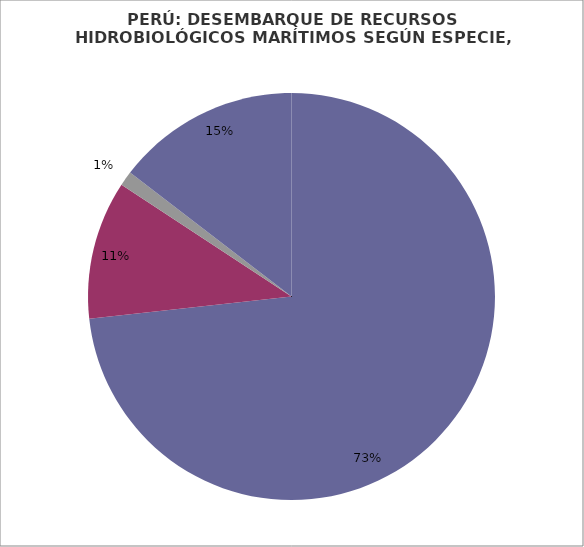
| Category | Series 0 |
|---|---|
| Anchoveta | 3504630.035 |
| Pota | 526902.043 |
| Caballa | 55520.538 |
| Otros | 697635.423 |